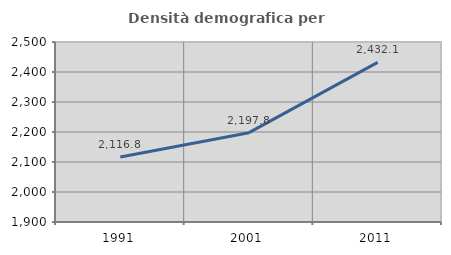
| Category | Densità demografica |
|---|---|
| 1991.0 | 2116.825 |
| 2001.0 | 2197.763 |
| 2011.0 | 2432.087 |